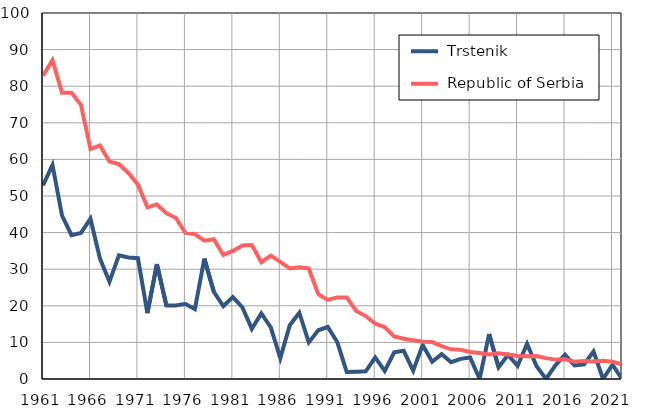
| Category |  Trstenik |  Republic of Serbia |
|---|---|---|
| 1961.0 | 52.9 | 82.9 |
| 1962.0 | 58.5 | 87.1 |
| 1963.0 | 44.7 | 78.2 |
| 1964.0 | 39.3 | 78.2 |
| 1965.0 | 39.9 | 74.9 |
| 1966.0 | 43.8 | 62.8 |
| 1967.0 | 32.9 | 63.8 |
| 1968.0 | 26.6 | 59.4 |
| 1969.0 | 33.8 | 58.7 |
| 1970.0 | 33.2 | 56.3 |
| 1971.0 | 33 | 53.1 |
| 1972.0 | 18 | 46.9 |
| 1973.0 | 31.4 | 47.7 |
| 1974.0 | 20.1 | 45.3 |
| 1975.0 | 20.1 | 44 |
| 1976.0 | 20.5 | 39.9 |
| 1977.0 | 19.1 | 39.6 |
| 1978.0 | 32.9 | 37.8 |
| 1979.0 | 23.8 | 38.2 |
| 1980.0 | 19.9 | 33.9 |
| 1981.0 | 22.4 | 35 |
| 1982.0 | 19.6 | 36.5 |
| 1983.0 | 13.7 | 36.6 |
| 1984.0 | 17.9 | 31.9 |
| 1985.0 | 14.1 | 33.7 |
| 1986.0 | 5.7 | 32 |
| 1987.0 | 14.7 | 30.2 |
| 1988.0 | 18.1 | 30.5 |
| 1989.0 | 10 | 30.2 |
| 1990.0 | 13.3 | 23.2 |
| 1991.0 | 14.2 | 21.6 |
| 1992.0 | 10.1 | 22.3 |
| 1993.0 | 1.9 | 22.3 |
| 1994.0 | 2 | 18.6 |
| 1995.0 | 2.1 | 17.2 |
| 1996.0 | 5.9 | 15.1 |
| 1997.0 | 2.2 | 14.2 |
| 1998.0 | 7.3 | 11.6 |
| 1999.0 | 7.7 | 11 |
| 2000.0 | 2.3 | 10.6 |
| 2001.0 | 9.3 | 10.2 |
| 2002.0 | 4.7 | 10.1 |
| 2003.0 | 6.8 | 9 |
| 2004.0 | 4.6 | 8.1 |
| 2005.0 | 5.5 | 8 |
| 2006.0 | 5.9 | 7.4 |
| 2007.0 | 0 | 7.1 |
| 2008.0 | 12.3 | 6.7 |
| 2009.0 | 3.2 | 7 |
| 2010.0 | 6.6 | 6.7 |
| 2011.0 | 3.6 | 6.3 |
| 2012.0 | 9.6 | 6.2 |
| 2013.0 | 3.5 | 6.3 |
| 2014.0 | 0 | 5.7 |
| 2015.0 | 3.8 | 5.3 |
| 2016.0 | 6.6 | 5.4 |
| 2017.0 | 3.7 | 4.7 |
| 2018.0 | 4 | 4.9 |
| 2019.0 | 7.5 | 4.8 |
| 2020.0 | 0 | 5 |
| 2021.0 | 3.9 | 4.7 |
| 2022.0 | 0 | 4 |